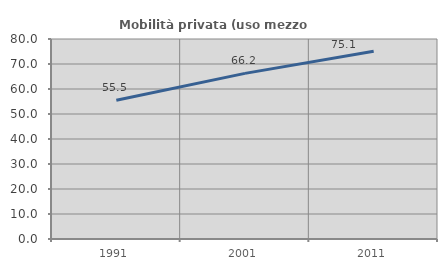
| Category | Mobilità privata (uso mezzo privato) |
|---|---|
| 1991.0 | 55.532 |
| 2001.0 | 66.243 |
| 2011.0 | 75.107 |